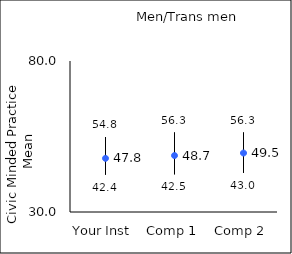
| Category | 25th percentile | 75th percentile | Mean |
|---|---|---|---|
| Your Inst | 42.4 | 54.8 | 47.77 |
| Comp 1 | 42.5 | 56.3 | 48.69 |
| Comp 2 | 43 | 56.3 | 49.53 |